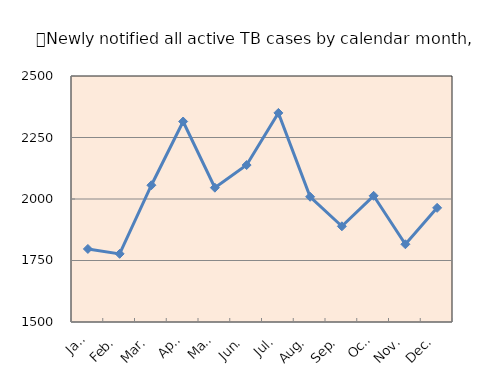
| Category | All active TB |
|---|---|
| Jan. | 1797 |
| Feb. | 1777 |
| Mar. | 2056 |
| Apr. | 2315 |
| May. | 2046 |
| Jun. | 2138 |
| Jul. | 2350 |
| Aug. | 2009 |
| Sep. | 1889 |
| Oct. | 2013 |
| Nov. | 1816 |
| Dec. | 1964 |